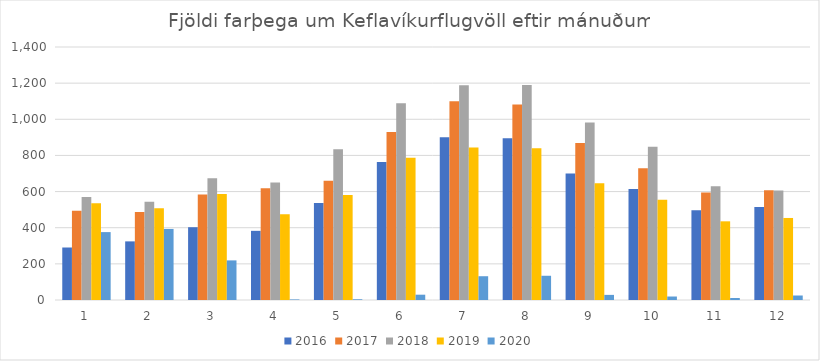
| Category | 2016 | 2017 | 2018 | 2019 | 2020 |
|---|---|---|---|---|---|
| 1.0 | 290497 | 493831 | 569332 | 535210 | 375723 |
| 2.0 | 324380 | 486912 | 543701 | 508183 | 393286 |
| 3.0 | 402782 | 583159 | 673985 | 586873 | 219162 |
| 4.0 | 382750 | 618915 | 649900 | 474519 | 3132 |
| 5.0 | 537017 | 659524 | 834382 | 580701 | 4064 |
| 6.0 | 763479 | 930077 | 1088782 | 787752 | 29355 |
| 7.0 | 900356 | 1099963 | 1187662 | 843473 | 131611 |
| 8.0 | 894535 | 1081409 | 1189250 | 840173 | 134108 |
| 9.0 | 700292 | 869063 | 982828 | 646415 | 28317 |
| 10.0 | 614611 | 729563 | 848686 | 555250 | 19288 |
| 11.0 | 496329 | 594789 | 629189 | 435339 | 11018 |
| 12.0 | 514598 | 607176 | 606618 | 453932 | 24907 |